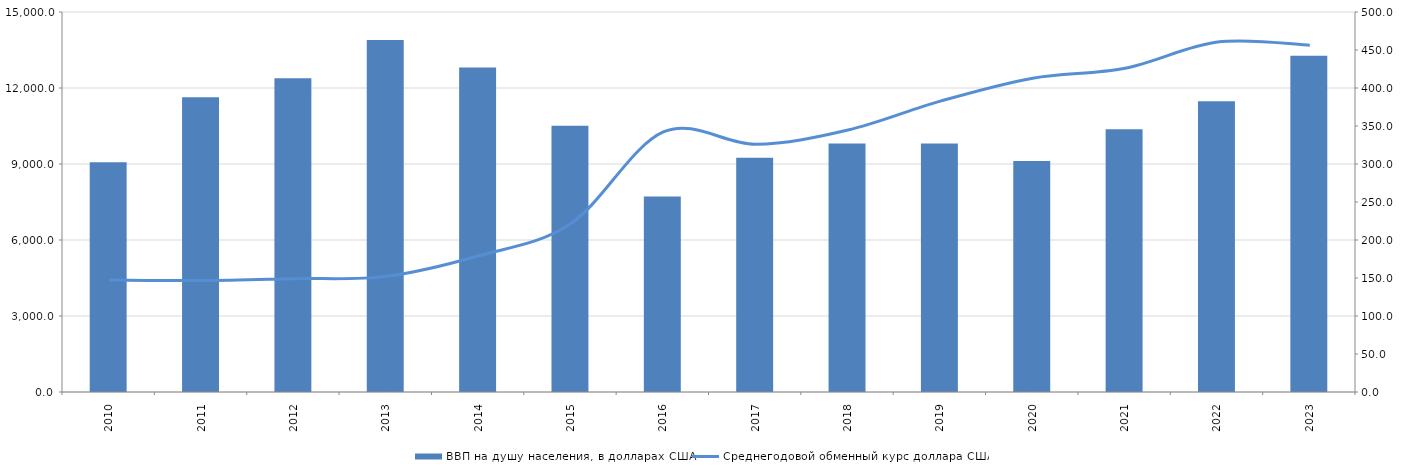
| Category | ВВП на душу населения, в долларах США |
|---|---|
| 2010.0 | 9071 |
| 2011.0 | 11634.5 |
| 2012.0 | 12387.4 |
| 2013.0 | 13890.8 |
| 2014.0 | 12806.7 |
| 2015.0 | 10509.9 |
| 2016.0 | 7714.8 |
| 2017.0 | 9247.6 |
| 2018.0 | 9812.5 |
| 2019.0 | 9812.5 |
| 2020.0 | 9121.7 |
| 2021.0 | 10370.8 |
| 2022.0 | 11476.6 |
| 2023.0 | 13276.7 |